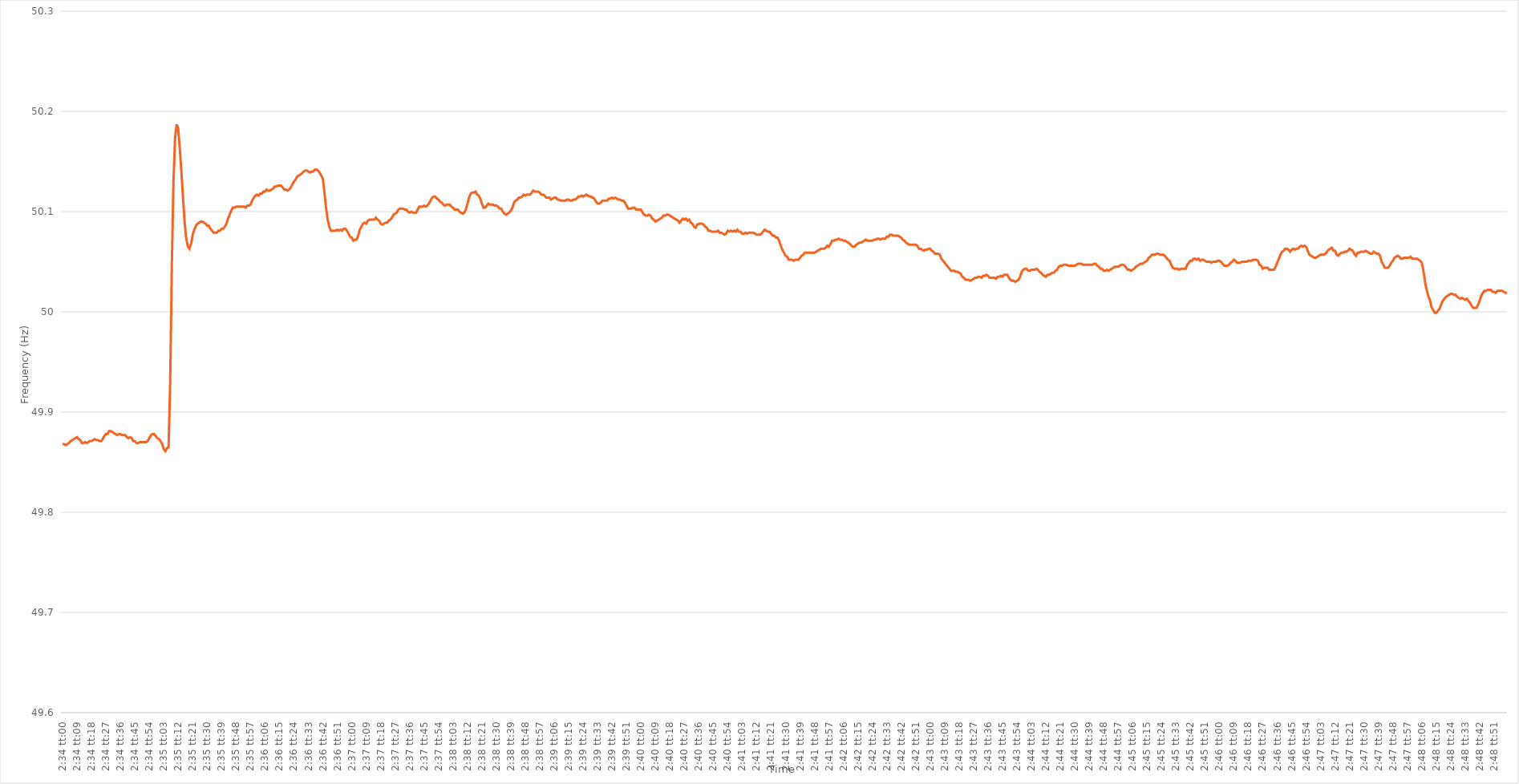
| Category | Series 0 |
|---|---|
| 0.10694444444444444 | 49.868 |
| 0.1069560185185185 | 49.868 |
| 0.10696759259259259 | 49.867 |
| 0.10697916666666667 | 49.868 |
| 0.10699074074074073 | 49.869 |
| 0.10700231481481481 | 49.871 |
| 0.1070138888888889 | 49.872 |
| 0.10702546296296296 | 49.873 |
| 0.10703703703703704 | 49.874 |
| 0.10704861111111112 | 49.875 |
| 0.10706018518518519 | 49.873 |
| 0.10707175925925926 | 49.872 |
| 0.10708333333333335 | 49.869 |
| 0.1070949074074074 | 49.869 |
| 0.10710648148148148 | 49.87 |
| 0.10711805555555555 | 49.869 |
| 0.10712962962962963 | 49.87 |
| 0.10714120370370371 | 49.871 |
| 0.10715277777777778 | 49.871 |
| 0.10716435185185186 | 49.872 |
| 0.10717592592592594 | 49.873 |
| 0.10718749999999999 | 49.872 |
| 0.10719907407407407 | 49.872 |
| 0.10721064814814814 | 49.871 |
| 0.10722222222222222 | 49.871 |
| 0.1072337962962963 | 49.873 |
| 0.10724537037037037 | 49.876 |
| 0.10725694444444445 | 49.878 |
| 0.10726851851851853 | 49.878 |
| 0.1072800925925926 | 49.881 |
| 0.10729166666666667 | 49.881 |
| 0.10730324074074075 | 49.88 |
| 0.10731481481481481 | 49.879 |
| 0.10732638888888889 | 49.878 |
| 0.10733796296296295 | 49.877 |
| 0.10734953703703703 | 49.878 |
| 0.10736111111111112 | 49.878 |
| 0.10737268518518518 | 49.877 |
| 0.10738425925925926 | 49.877 |
| 0.10739583333333334 | 49.877 |
| 0.1074074074074074 | 49.875 |
| 0.10741898148148148 | 49.874 |
| 0.10743055555555554 | 49.875 |
| 0.10744212962962962 | 49.874 |
| 0.1074537037037037 | 49.871 |
| 0.10746527777777777 | 49.871 |
| 0.10747685185185185 | 49.869 |
| 0.10748842592592593 | 49.869 |
| 0.1075 | 49.87 |
| 0.10751157407407408 | 49.87 |
| 0.10752314814814816 | 49.87 |
| 0.10753472222222223 | 49.87 |
| 0.1075462962962963 | 49.87 |
| 0.10755787037037036 | 49.871 |
| 0.10756944444444444 | 49.874 |
| 0.10758101851851852 | 49.877 |
| 0.10759259259259259 | 49.878 |
| 0.10760416666666667 | 49.878 |
| 0.10761574074074075 | 49.876 |
| 0.10762731481481481 | 49.874 |
| 0.1076388888888889 | 49.873 |
| 0.10765046296296295 | 49.871 |
| 0.10766203703703703 | 49.868 |
| 0.10767361111111111 | 49.863 |
| 0.10768518518518518 | 49.861 |
| 0.10769675925925926 | 49.864 |
| 0.10770833333333334 | 49.865 |
| 0.1077199074074074 | 49.93 |
| 0.10773148148148148 | 50.045 |
| 0.10774305555555556 | 50.128 |
| 0.10775462962962963 | 50.173 |
| 0.10776620370370371 | 50.187 |
| 0.10777777777777779 | 50.182 |
| 0.10778935185185186 | 50.162 |
| 0.10780092592592593 | 50.139 |
| 0.10781249999999999 | 50.113 |
| 0.10782407407407407 | 50.089 |
| 0.10783564814814815 | 50.073 |
| 0.10784722222222222 | 50.065 |
| 0.1078587962962963 | 50.063 |
| 0.10787037037037038 | 50.068 |
| 0.10788194444444445 | 50.077 |
| 0.10789351851851851 | 50.082 |
| 0.10790509259259258 | 50.086 |
| 0.10791666666666666 | 50.088 |
| 0.10792824074074074 | 50.089 |
| 0.10793981481481481 | 50.09 |
| 0.10795138888888889 | 50.09 |
| 0.10796296296296297 | 50.089 |
| 0.10797453703703704 | 50.088 |
| 0.10798611111111112 | 50.086 |
| 0.1079976851851852 | 50.086 |
| 0.10800925925925926 | 50.083 |
| 0.10802083333333333 | 50.081 |
| 0.10803240740740742 | 50.079 |
| 0.10804398148148148 | 50.079 |
| 0.10805555555555556 | 50.079 |
| 0.10806712962962962 | 50.081 |
| 0.1080787037037037 | 50.081 |
| 0.10809027777777779 | 50.083 |
| 0.10810185185185185 | 50.083 |
| 0.10811342592592592 | 50.085 |
| 0.10812500000000001 | 50.088 |
| 0.10813657407407407 | 50.093 |
| 0.10814814814814815 | 50.097 |
| 0.10815972222222221 | 50.101 |
| 0.1081712962962963 | 50.104 |
| 0.10818287037037037 | 50.104 |
| 0.10819444444444444 | 50.105 |
| 0.10820601851851852 | 50.105 |
| 0.1082175925925926 | 50.105 |
| 0.10822916666666667 | 50.105 |
| 0.10824074074074075 | 50.105 |
| 0.10825231481481483 | 50.105 |
| 0.10826388888888888 | 50.104 |
| 0.10827546296296296 | 50.106 |
| 0.10828703703703703 | 50.106 |
| 0.10829861111111111 | 50.107 |
| 0.10831018518518519 | 50.111 |
| 0.10832175925925926 | 50.114 |
| 0.10833333333333334 | 50.116 |
| 0.10834490740740742 | 50.117 |
| 0.10835648148148147 | 50.116 |
| 0.10836805555555555 | 50.118 |
| 0.10837962962962962 | 50.118 |
| 0.1083912037037037 | 50.12 |
| 0.10840277777777778 | 50.12 |
| 0.10841435185185185 | 50.122 |
| 0.10842592592592593 | 50.121 |
| 0.1084375 | 50.121 |
| 0.10844907407407407 | 50.122 |
| 0.10846064814814815 | 50.123 |
| 0.10847222222222223 | 50.125 |
| 0.1084837962962963 | 50.125 |
| 0.10849537037037038 | 50.126 |
| 0.10850694444444443 | 50.126 |
| 0.10851851851851851 | 50.126 |
| 0.1085300925925926 | 50.124 |
| 0.10854166666666666 | 50.122 |
| 0.10855324074074074 | 50.122 |
| 0.10856481481481482 | 50.121 |
| 0.10857638888888889 | 50.122 |
| 0.10858796296296297 | 50.124 |
| 0.10859953703703702 | 50.127 |
| 0.1086111111111111 | 50.13 |
| 0.10862268518518518 | 50.132 |
| 0.10863425925925925 | 50.135 |
| 0.10864583333333333 | 50.136 |
| 0.10865740740740741 | 50.137 |
| 0.10866898148148148 | 50.138 |
| 0.10868055555555556 | 50.14 |
| 0.10869212962962964 | 50.141 |
| 0.1087037037037037 | 50.141 |
| 0.10871527777777779 | 50.14 |
| 0.10872685185185187 | 50.139 |
| 0.10873842592592593 | 50.14 |
| 0.10875 | 50.14 |
| 0.10876157407407407 | 50.142 |
| 0.10877314814814815 | 50.142 |
| 0.10878472222222223 | 50.141 |
| 0.1087962962962963 | 50.139 |
| 0.10880787037037037 | 50.136 |
| 0.10881944444444445 | 50.133 |
| 0.10883101851851852 | 50.119 |
| 0.10884259259259259 | 50.104 |
| 0.10885416666666665 | 50.092 |
| 0.10886574074074074 | 50.085 |
| 0.10887731481481482 | 50.081 |
| 0.10888888888888888 | 50.081 |
| 0.10890046296296296 | 50.081 |
| 0.10891203703703704 | 50.081 |
| 0.10892361111111111 | 50.082 |
| 0.10893518518518519 | 50.081 |
| 0.10894675925925927 | 50.082 |
| 0.10895833333333334 | 50.081 |
| 0.1089699074074074 | 50.083 |
| 0.10898148148148147 | 50.083 |
| 0.10899305555555555 | 50.081 |
| 0.10900462962962963 | 50.078 |
| 0.1090162037037037 | 50.075 |
| 0.10902777777777778 | 50.074 |
| 0.10903935185185186 | 50.071 |
| 0.10905092592592593 | 50.072 |
| 0.10906249999999999 | 50.072 |
| 0.10907407407407409 | 50.076 |
| 0.10908564814814814 | 50.082 |
| 0.10909722222222222 | 50.085 |
| 0.10910879629629629 | 50.088 |
| 0.10912037037037037 | 50.089 |
| 0.10913194444444445 | 50.088 |
| 0.10914351851851851 | 50.091 |
| 0.1091550925925926 | 50.092 |
| 0.10916666666666668 | 50.092 |
| 0.10917824074074074 | 50.092 |
| 0.10918981481481482 | 50.092 |
| 0.1092013888888889 | 50.094 |
| 0.10921296296296296 | 50.092 |
| 0.10922453703703704 | 50.091 |
| 0.1092361111111111 | 50.088 |
| 0.10924768518518518 | 50.087 |
| 0.10925925925925926 | 50.088 |
| 0.10927083333333333 | 50.089 |
| 0.10928240740740741 | 50.089 |
| 0.10929398148148149 | 50.091 |
| 0.10930555555555554 | 50.092 |
| 0.10931712962962963 | 50.094 |
| 0.10932870370370369 | 50.097 |
| 0.10934027777777777 | 50.098 |
| 0.10935185185185185 | 50.099 |
| 0.10936342592592592 | 50.102 |
| 0.109375 | 50.103 |
| 0.10938657407407408 | 50.103 |
| 0.10939814814814815 | 50.103 |
| 0.10940972222222223 | 50.102 |
| 0.10942129629629631 | 50.102 |
| 0.10943287037037037 | 50.1 |
| 0.10944444444444446 | 50.099 |
| 0.10945601851851851 | 50.1 |
| 0.10946759259259259 | 50.099 |
| 0.10947916666666667 | 50.099 |
| 0.10949074074074074 | 50.099 |
| 0.10950231481481482 | 50.102 |
| 0.1095138888888889 | 50.105 |
| 0.10952546296296296 | 50.105 |
| 0.10953703703703704 | 50.105 |
| 0.1095486111111111 | 50.106 |
| 0.10956018518518518 | 50.105 |
| 0.10957175925925926 | 50.106 |
| 0.10958333333333332 | 50.108 |
| 0.1095949074074074 | 50.111 |
| 0.10960648148148149 | 50.114 |
| 0.10961805555555555 | 50.115 |
| 0.10962962962962963 | 50.115 |
| 0.10964120370370371 | 50.113 |
| 0.10965277777777778 | 50.112 |
| 0.10966435185185186 | 50.11 |
| 0.10967592592592591 | 50.109 |
| 0.10968750000000001 | 50.107 |
| 0.10969907407407407 | 50.106 |
| 0.10971064814814814 | 50.107 |
| 0.10972222222222222 | 50.107 |
| 0.1097337962962963 | 50.107 |
| 0.10974537037037037 | 50.105 |
| 0.10975694444444445 | 50.104 |
| 0.10976851851851853 | 50.102 |
| 0.1097800925925926 | 50.102 |
| 0.10979166666666666 | 50.102 |
| 0.10980324074074073 | 50.1 |
| 0.10981481481481481 | 50.099 |
| 0.10982638888888889 | 50.098 |
| 0.10983796296296296 | 50.099 |
| 0.10984953703703704 | 50.102 |
| 0.10986111111111112 | 50.108 |
| 0.10987268518518518 | 50.114 |
| 0.10988425925925926 | 50.118 |
| 0.10989583333333335 | 50.119 |
| 0.10990740740740741 | 50.119 |
| 0.10991898148148148 | 50.12 |
| 0.10993055555555555 | 50.117 |
| 0.10994212962962963 | 50.116 |
| 0.1099537037037037 | 50.113 |
| 0.10996527777777777 | 50.108 |
| 0.10997685185185185 | 50.104 |
| 0.10998842592592593 | 50.104 |
| 0.11 | 50.106 |
| 0.11001157407407407 | 50.108 |
| 0.11002314814814813 | 50.107 |
| 0.11003472222222221 | 50.107 |
| 0.1100462962962963 | 50.107 |
| 0.11005787037037036 | 50.106 |
| 0.11006944444444444 | 50.106 |
| 0.11008101851851852 | 50.105 |
| 0.11009259259259259 | 50.103 |
| 0.11010416666666667 | 50.103 |
| 0.11011574074074075 | 50.1 |
| 0.11012731481481482 | 50.098 |
| 0.1101388888888889 | 50.097 |
| 0.11015046296296298 | 50.098 |
| 0.11016203703703703 | 50.099 |
| 0.11017361111111111 | 50.101 |
| 0.11018518518518518 | 50.104 |
| 0.11019675925925926 | 50.109 |
| 0.11020833333333334 | 50.111 |
| 0.1102199074074074 | 50.112 |
| 0.11023148148148149 | 50.114 |
| 0.11024305555555557 | 50.114 |
| 0.11025462962962962 | 50.115 |
| 0.1102662037037037 | 50.117 |
| 0.11027777777777777 | 50.116 |
| 0.11028935185185185 | 50.117 |
| 0.11030092592592593 | 50.117 |
| 0.1103125 | 50.117 |
| 0.11032407407407407 | 50.119 |
| 0.11033564814814815 | 50.121 |
| 0.11034722222222222 | 50.12 |
| 0.1103587962962963 | 50.12 |
| 0.11037037037037038 | 50.12 |
| 0.11038194444444445 | 50.119 |
| 0.11039351851851853 | 50.117 |
| 0.11040509259259258 | 50.117 |
| 0.11041666666666666 | 50.116 |
| 0.11042824074074074 | 50.114 |
| 0.11043981481481481 | 50.114 |
| 0.11045138888888889 | 50.114 |
| 0.11046296296296297 | 50.112 |
| 0.11047453703703704 | 50.113 |
| 0.11048611111111112 | 50.114 |
| 0.11049768518518517 | 50.114 |
| 0.11050925925925925 | 50.112 |
| 0.11052083333333333 | 50.112 |
| 0.1105324074074074 | 50.111 |
| 0.11054398148148148 | 50.111 |
| 0.11055555555555556 | 50.111 |
| 0.11056712962962963 | 50.111 |
| 0.1105787037037037 | 50.112 |
| 0.11059027777777779 | 50.112 |
| 0.11060185185185185 | 50.111 |
| 0.11061342592592593 | 50.111 |
| 0.11062499999999999 | 50.112 |
| 0.11063657407407408 | 50.112 |
| 0.11064814814814815 | 50.113 |
| 0.11065972222222221 | 50.115 |
| 0.1106712962962963 | 50.115 |
| 0.11068287037037038 | 50.116 |
| 0.11069444444444444 | 50.115 |
| 0.11070601851851852 | 50.116 |
| 0.11071759259259258 | 50.117 |
| 0.11072916666666667 | 50.116 |
| 0.11074074074074074 | 50.115 |
| 0.1107523148148148 | 50.115 |
| 0.11076388888888888 | 50.114 |
| 0.11077546296296296 | 50.113 |
| 0.11078703703703703 | 50.11 |
| 0.11079861111111111 | 50.108 |
| 0.11081018518518519 | 50.108 |
| 0.11082175925925926 | 50.109 |
| 0.11083333333333334 | 50.111 |
| 0.11084490740740742 | 50.111 |
| 0.11085648148148149 | 50.111 |
| 0.11086805555555555 | 50.111 |
| 0.11087962962962962 | 50.113 |
| 0.1108912037037037 | 50.113 |
| 0.11090277777777778 | 50.114 |
| 0.11091435185185185 | 50.113 |
| 0.11092592592592593 | 50.114 |
| 0.11093750000000001 | 50.113 |
| 0.11094907407407407 | 50.112 |
| 0.11096064814814814 | 50.112 |
| 0.11097222222222221 | 50.111 |
| 0.11098379629629629 | 50.111 |
| 0.11099537037037037 | 50.109 |
| 0.11100694444444444 | 50.106 |
| 0.11101851851851852 | 50.103 |
| 0.1110300925925926 | 50.103 |
| 0.11104166666666666 | 50.103 |
| 0.11105324074074074 | 50.104 |
| 0.11106481481481482 | 50.104 |
| 0.11107638888888889 | 50.102 |
| 0.11108796296296297 | 50.102 |
| 0.11109953703703705 | 50.102 |
| 0.1111111111111111 | 50.102 |
| 0.11112268518518519 | 50.099 |
| 0.11113425925925925 | 50.097 |
| 0.11114583333333333 | 50.096 |
| 0.11115740740740741 | 50.096 |
| 0.11116898148148148 | 50.097 |
| 0.11118055555555556 | 50.096 |
| 0.11119212962962964 | 50.093 |
| 0.1112037037037037 | 50.092 |
| 0.11121527777777777 | 50.09 |
| 0.11122685185185184 | 50.091 |
| 0.11123842592592592 | 50.092 |
| 0.11125 | 50.093 |
| 0.11126157407407407 | 50.094 |
| 0.11127314814814815 | 50.096 |
| 0.11128472222222223 | 50.096 |
| 0.1112962962962963 | 50.097 |
| 0.11130787037037038 | 50.097 |
| 0.11131944444444446 | 50.096 |
| 0.11133101851851852 | 50.095 |
| 0.1113425925925926 | 50.094 |
| 0.11135416666666666 | 50.093 |
| 0.11136574074074074 | 50.092 |
| 0.11137731481481482 | 50.091 |
| 0.11138888888888888 | 50.089 |
| 0.11140046296296297 | 50.091 |
| 0.11141203703703705 | 50.093 |
| 0.11142361111111111 | 50.092 |
| 0.11143518518518519 | 50.093 |
| 0.11144675925925925 | 50.091 |
| 0.11145833333333333 | 50.092 |
| 0.1114699074074074 | 50.089 |
| 0.11148148148148147 | 50.088 |
| 0.11149305555555555 | 50.085 |
| 0.11150462962962963 | 50.084 |
| 0.1115162037037037 | 50.087 |
| 0.11152777777777778 | 50.088 |
| 0.11153935185185186 | 50.088 |
| 0.11155092592592593 | 50.088 |
| 0.11156250000000001 | 50.087 |
| 0.11157407407407406 | 50.085 |
| 0.11158564814814814 | 50.084 |
| 0.11159722222222222 | 50.081 |
| 0.11160879629629629 | 50.081 |
| 0.11162037037037037 | 50.08 |
| 0.11163194444444445 | 50.08 |
| 0.11164351851851852 | 50.08 |
| 0.1116550925925926 | 50.08 |
| 0.11166666666666665 | 50.081 |
| 0.11167824074074074 | 50.079 |
| 0.11168981481481481 | 50.079 |
| 0.11170138888888888 | 50.078 |
| 0.11171296296296296 | 50.077 |
| 0.11172453703703704 | 50.078 |
| 0.1117361111111111 | 50.081 |
| 0.11174768518518519 | 50.08 |
| 0.11175925925925927 | 50.081 |
| 0.11177083333333333 | 50.08 |
| 0.11178240740740741 | 50.081 |
| 0.1117939814814815 | 50.08 |
| 0.11180555555555556 | 50.082 |
| 0.11181712962962963 | 50.08 |
| 0.1118287037037037 | 50.08 |
| 0.11184027777777777 | 50.078 |
| 0.11185185185185186 | 50.078 |
| 0.11186342592592592 | 50.079 |
| 0.111875 | 50.078 |
| 0.11188657407407408 | 50.079 |
| 0.11189814814814815 | 50.079 |
| 0.11190972222222222 | 50.079 |
| 0.11192129629629628 | 50.079 |
| 0.11193287037037036 | 50.078 |
| 0.11194444444444444 | 50.077 |
| 0.11195601851851851 | 50.077 |
| 0.11196759259259259 | 50.077 |
| 0.11197916666666667 | 50.078 |
| 0.11199074074074074 | 50.08 |
| 0.11200231481481482 | 50.082 |
| 0.1120138888888889 | 50.081 |
| 0.11202546296296297 | 50.08 |
| 0.11203703703703705 | 50.08 |
| 0.11204861111111113 | 50.078 |
| 0.11206018518518518 | 50.076 |
| 0.11207175925925926 | 50.076 |
| 0.11208333333333333 | 50.074 |
| 0.11209490740740741 | 50.074 |
| 0.11210648148148149 | 50.071 |
| 0.11211805555555555 | 50.066 |
| 0.11212962962962963 | 50.062 |
| 0.11214120370370372 | 50.059 |
| 0.11215277777777777 | 50.056 |
| 0.11216435185185185 | 50.055 |
| 0.11217592592592592 | 50.052 |
| 0.1121875 | 50.052 |
| 0.11219907407407408 | 50.052 |
| 0.11221064814814814 | 50.051 |
| 0.11222222222222222 | 50.052 |
| 0.1122337962962963 | 50.052 |
| 0.11224537037037037 | 50.052 |
| 0.11225694444444445 | 50.054 |
| 0.11226851851851853 | 50.056 |
| 0.11228009259259258 | 50.057 |
| 0.11229166666666668 | 50.059 |
| 0.11230324074074073 | 50.059 |
| 0.11231481481481481 | 50.059 |
| 0.11232638888888889 | 50.059 |
| 0.11233796296296296 | 50.059 |
| 0.11234953703703704 | 50.059 |
| 0.11236111111111112 | 50.059 |
| 0.11237268518518519 | 50.06 |
| 0.11238425925925927 | 50.061 |
| 0.11239583333333332 | 50.062 |
| 0.1124074074074074 | 50.063 |
| 0.11241898148148148 | 50.063 |
| 0.11243055555555555 | 50.063 |
| 0.11244212962962963 | 50.064 |
| 0.11245370370370371 | 50.066 |
| 0.11246527777777778 | 50.065 |
| 0.11247685185185186 | 50.068 |
| 0.11248842592592594 | 50.071 |
| 0.1125 | 50.071 |
| 0.11251157407407408 | 50.072 |
| 0.11252314814814814 | 50.072 |
| 0.11253472222222222 | 50.073 |
| 0.1125462962962963 | 50.072 |
| 0.11255787037037036 | 50.072 |
| 0.11256944444444444 | 50.071 |
| 0.11258101851851852 | 50.071 |
| 0.11259259259259259 | 50.07 |
| 0.11260416666666667 | 50.069 |
| 0.11261574074074072 | 50.068 |
| 0.1126273148148148 | 50.066 |
| 0.11263888888888889 | 50.065 |
| 0.11265046296296295 | 50.065 |
| 0.11266203703703703 | 50.067 |
| 0.11267361111111111 | 50.068 |
| 0.11268518518518518 | 50.069 |
| 0.11269675925925926 | 50.069 |
| 0.11270833333333334 | 50.07 |
| 0.11271990740740741 | 50.071 |
| 0.11273148148148149 | 50.072 |
| 0.11274305555555557 | 50.071 |
| 0.11275462962962964 | 50.071 |
| 0.1127662037037037 | 50.071 |
| 0.11277777777777777 | 50.071 |
| 0.11278935185185185 | 50.072 |
| 0.11280092592592593 | 50.072 |
| 0.1128125 | 50.073 |
| 0.11282407407407408 | 50.073 |
| 0.11283564814814816 | 50.072 |
| 0.11284722222222222 | 50.073 |
| 0.11285879629629629 | 50.073 |
| 0.11287037037037036 | 50.073 |
| 0.11288194444444444 | 50.075 |
| 0.11289351851851852 | 50.075 |
| 0.11290509259259258 | 50.077 |
| 0.11291666666666667 | 50.077 |
| 0.11292824074074075 | 50.076 |
| 0.11293981481481481 | 50.076 |
| 0.11295138888888889 | 50.076 |
| 0.11296296296296297 | 50.076 |
| 0.11297453703703704 | 50.075 |
| 0.11298611111111112 | 50.074 |
| 0.1129976851851852 | 50.072 |
| 0.11300925925925925 | 50.071 |
| 0.11302083333333333 | 50.069 |
| 0.1130324074074074 | 50.068 |
| 0.11304398148148148 | 50.067 |
| 0.11305555555555556 | 50.067 |
| 0.11306712962962963 | 50.067 |
| 0.11307870370370371 | 50.067 |
| 0.11309027777777779 | 50.067 |
| 0.11310185185185184 | 50.066 |
| 0.11311342592592592 | 50.063 |
| 0.11312499999999999 | 50.063 |
| 0.11313657407407407 | 50.062 |
| 0.11314814814814815 | 50.061 |
| 0.11315972222222222 | 50.062 |
| 0.1131712962962963 | 50.062 |
| 0.11318287037037038 | 50.063 |
| 0.11319444444444444 | 50.063 |
| 0.11320601851851853 | 50.061 |
| 0.1132175925925926 | 50.06 |
| 0.11322916666666666 | 50.058 |
| 0.11324074074074075 | 50.058 |
| 0.1132523148148148 | 50.058 |
| 0.11326388888888889 | 50.057 |
| 0.11327546296296297 | 50.053 |
| 0.11328703703703703 | 50.051 |
| 0.11329861111111111 | 50.049 |
| 0.1133101851851852 | 50.047 |
| 0.11332175925925925 | 50.045 |
| 0.11333333333333334 | 50.043 |
| 0.1133449074074074 | 50.041 |
| 0.11335648148148147 | 50.041 |
| 0.11336805555555556 | 50.041 |
| 0.11337962962962962 | 50.04 |
| 0.1133912037037037 | 50.04 |
| 0.11340277777777778 | 50.039 |
| 0.11341435185185185 | 50.038 |
| 0.11342592592592593 | 50.035 |
| 0.11343750000000001 | 50.034 |
| 0.11344907407407408 | 50.032 |
| 0.11346064814814816 | 50.032 |
| 0.11347222222222221 | 50.032 |
| 0.11348379629629629 | 50.031 |
| 0.11349537037037037 | 50.032 |
| 0.11350694444444444 | 50.033 |
| 0.11351851851851852 | 50.034 |
| 0.1135300925925926 | 50.034 |
| 0.11354166666666667 | 50.035 |
| 0.11355324074074075 | 50.035 |
| 0.1135648148148148 | 50.034 |
| 0.11357638888888888 | 50.036 |
| 0.11358796296296296 | 50.036 |
| 0.11359953703703703 | 50.037 |
| 0.11361111111111111 | 50.036 |
| 0.11362268518518519 | 50.034 |
| 0.11363425925925925 | 50.034 |
| 0.11364583333333333 | 50.034 |
| 0.11365740740740742 | 50.034 |
| 0.11366898148148148 | 50.033 |
| 0.11368055555555556 | 50.035 |
| 0.11369212962962964 | 50.035 |
| 0.11370370370370371 | 50.036 |
| 0.11371527777777778 | 50.035 |
| 0.11372685185185184 | 50.037 |
| 0.11373842592592592 | 50.037 |
| 0.11375 | 50.037 |
| 0.11376157407407407 | 50.034 |
| 0.11377314814814815 | 50.032 |
| 0.11378472222222223 | 50.031 |
| 0.1137962962962963 | 50.031 |
| 0.11380787037037036 | 50.03 |
| 0.11381944444444443 | 50.031 |
| 0.11383101851851851 | 50.032 |
| 0.11384259259259259 | 50.035 |
| 0.11385416666666666 | 50.04 |
| 0.11386574074074074 | 50.042 |
| 0.11387731481481482 | 50.043 |
| 0.11388888888888889 | 50.043 |
| 0.11390046296296297 | 50.041 |
| 0.11391203703703705 | 50.041 |
| 0.11392361111111111 | 50.042 |
| 0.1139351851851852 | 50.042 |
| 0.11394675925925928 | 50.042 |
| 0.11395833333333333 | 50.043 |
| 0.11396990740740741 | 50.042 |
| 0.11398148148148148 | 50.04 |
| 0.11399305555555556 | 50.039 |
| 0.11400462962962964 | 50.037 |
| 0.1140162037037037 | 50.036 |
| 0.11402777777777778 | 50.035 |
| 0.11403935185185186 | 50.037 |
| 0.11405092592592592 | 50.037 |
| 0.1140625 | 50.038 |
| 0.11407407407407406 | 50.039 |
| 0.11408564814814814 | 50.039 |
| 0.11409722222222222 | 50.041 |
| 0.11410879629629629 | 50.042 |
| 0.11412037037037037 | 50.045 |
| 0.11413194444444445 | 50.046 |
| 0.11414351851851852 | 50.046 |
| 0.1141550925925926 | 50.047 |
| 0.11416666666666668 | 50.047 |
| 0.11417824074074073 | 50.047 |
| 0.11418981481481481 | 50.046 |
| 0.11420138888888888 | 50.046 |
| 0.11421296296296296 | 50.046 |
| 0.11422453703703704 | 50.046 |
| 0.11423611111111111 | 50.046 |
| 0.11424768518518519 | 50.047 |
| 0.11425925925925927 | 50.048 |
| 0.11427083333333332 | 50.048 |
| 0.11428240740740742 | 50.048 |
| 0.11429398148148147 | 50.047 |
| 0.11430555555555555 | 50.047 |
| 0.11431712962962963 | 50.047 |
| 0.1143287037037037 | 50.047 |
| 0.11434027777777778 | 50.047 |
| 0.11435185185185186 | 50.047 |
| 0.11436342592592592 | 50.047 |
| 0.114375 | 50.048 |
| 0.11438657407407408 | 50.048 |
| 0.11439814814814815 | 50.046 |
| 0.11440972222222223 | 50.045 |
| 0.11442129629629628 | 50.043 |
| 0.11443287037037037 | 50.043 |
| 0.11444444444444445 | 50.041 |
| 0.11445601851851851 | 50.041 |
| 0.11446759259259259 | 50.042 |
| 0.11447916666666667 | 50.041 |
| 0.11449074074074074 | 50.042 |
| 0.11450231481481482 | 50.043 |
| 0.11451388888888887 | 50.044 |
| 0.11452546296296295 | 50.045 |
| 0.11453703703703703 | 50.045 |
| 0.1145486111111111 | 50.045 |
| 0.11456018518518518 | 50.046 |
| 0.11457175925925926 | 50.047 |
| 0.11458333333333333 | 50.047 |
| 0.11459490740740741 | 50.046 |
| 0.11460648148148149 | 50.044 |
| 0.11461805555555556 | 50.042 |
| 0.11462962962962964 | 50.042 |
| 0.11464120370370372 | 50.041 |
| 0.11465277777777778 | 50.042 |
| 0.11466435185185185 | 50.043 |
| 0.11467592592592592 | 50.045 |
| 0.1146875 | 50.046 |
| 0.11469907407407408 | 50.047 |
| 0.11471064814814814 | 50.048 |
| 0.11472222222222223 | 50.048 |
| 0.1147337962962963 | 50.049 |
| 0.11474537037037037 | 50.05 |
| 0.11475694444444444 | 50.051 |
| 0.1147685185185185 | 50.054 |
| 0.11478009259259259 | 50.055 |
| 0.11479166666666667 | 50.057 |
| 0.11480324074074073 | 50.057 |
| 0.11481481481481481 | 50.057 |
| 0.1148263888888889 | 50.058 |
| 0.11483796296296296 | 50.058 |
| 0.11484953703703704 | 50.057 |
| 0.11486111111111112 | 50.057 |
| 0.11487268518518519 | 50.057 |
| 0.11488425925925926 | 50.056 |
| 0.11489583333333335 | 50.054 |
| 0.1149074074074074 | 50.052 |
| 0.11491898148148148 | 50.051 |
| 0.11493055555555555 | 50.047 |
| 0.11494212962962963 | 50.044 |
| 0.11495370370370371 | 50.043 |
| 0.11496527777777778 | 50.043 |
| 0.11497685185185186 | 50.043 |
| 0.11498842592592594 | 50.042 |
| 0.11499999999999999 | 50.043 |
| 0.11501157407407407 | 50.043 |
| 0.11502314814814814 | 50.043 |
| 0.11503472222222222 | 50.043 |
| 0.1150462962962963 | 50.047 |
| 0.11505787037037037 | 50.049 |
| 0.11506944444444445 | 50.051 |
| 0.11508101851851853 | 50.051 |
| 0.1150925925925926 | 50.053 |
| 0.11510416666666667 | 50.053 |
| 0.11511574074074075 | 50.052 |
| 0.11512731481481481 | 50.053 |
| 0.11513888888888889 | 50.051 |
| 0.11515046296296295 | 50.052 |
| 0.11516203703703703 | 50.052 |
| 0.11517361111111112 | 50.051 |
| 0.11518518518518518 | 50.05 |
| 0.11519675925925926 | 50.05 |
| 0.11520833333333334 | 50.05 |
| 0.1152199074074074 | 50.049 |
| 0.11523148148148148 | 50.05 |
| 0.11524305555555554 | 50.05 |
| 0.11525462962962962 | 50.05 |
| 0.1152662037037037 | 50.051 |
| 0.11527777777777777 | 50.051 |
| 0.11528935185185185 | 50.05 |
| 0.11530092592592593 | 50.048 |
| 0.1153125 | 50.046 |
| 0.11532407407407408 | 50.046 |
| 0.11533564814814816 | 50.046 |
| 0.11534722222222223 | 50.047 |
| 0.1153587962962963 | 50.049 |
| 0.11537037037037036 | 50.05 |
| 0.11538194444444444 | 50.052 |
| 0.11539351851851852 | 50.051 |
| 0.11540509259259259 | 50.049 |
| 0.11541666666666667 | 50.049 |
| 0.11542824074074075 | 50.049 |
| 0.11543981481481481 | 50.05 |
| 0.1154513888888889 | 50.05 |
| 0.11546296296296295 | 50.05 |
| 0.11547453703703703 | 50.05 |
| 0.11548611111111111 | 50.051 |
| 0.11549768518518518 | 50.051 |
| 0.11550925925925926 | 50.051 |
| 0.11552083333333334 | 50.052 |
| 0.1155324074074074 | 50.052 |
| 0.11554398148148148 | 50.052 |
| 0.11555555555555556 | 50.051 |
| 0.11556712962962963 | 50.047 |
| 0.11557870370370371 | 50.046 |
| 0.11559027777777779 | 50.043 |
| 0.11560185185185186 | 50.044 |
| 0.11561342592592593 | 50.044 |
| 0.11562499999999999 | 50.044 |
| 0.11563657407407407 | 50.042 |
| 0.11564814814814815 | 50.042 |
| 0.11565972222222222 | 50.042 |
| 0.1156712962962963 | 50.042 |
| 0.11568287037037038 | 50.045 |
| 0.11569444444444445 | 50.049 |
| 0.11570601851851851 | 50.053 |
| 0.11571759259259258 | 50.057 |
| 0.11572916666666666 | 50.06 |
| 0.11574074074074074 | 50.061 |
| 0.11575231481481481 | 50.063 |
| 0.11576388888888889 | 50.063 |
| 0.11577546296296297 | 50.062 |
| 0.11578703703703704 | 50.06 |
| 0.11579861111111112 | 50.062 |
| 0.1158101851851852 | 50.063 |
| 0.11582175925925926 | 50.062 |
| 0.11583333333333333 | 50.063 |
| 0.11584490740740742 | 50.063 |
| 0.11585648148148148 | 50.065 |
| 0.11586805555555556 | 50.066 |
| 0.11587962962962962 | 50.065 |
| 0.1158912037037037 | 50.066 |
| 0.11590277777777779 | 50.065 |
| 0.11591435185185185 | 50.061 |
| 0.11592592592592592 | 50.057 |
| 0.11593750000000001 | 50.056 |
| 0.11594907407407407 | 50.055 |
| 0.11596064814814815 | 50.054 |
| 0.11597222222222221 | 50.054 |
| 0.1159837962962963 | 50.055 |
| 0.11599537037037037 | 50.056 |
| 0.11600694444444444 | 50.057 |
| 0.11601851851851852 | 50.057 |
| 0.1160300925925926 | 50.057 |
| 0.11604166666666667 | 50.058 |
| 0.11605324074074075 | 50.06 |
| 0.11606481481481483 | 50.062 |
| 0.11607638888888888 | 50.063 |
| 0.11608796296296296 | 50.064 |
| 0.11609953703703703 | 50.061 |
| 0.11611111111111111 | 50.061 |
| 0.11612268518518519 | 50.057 |
| 0.11613425925925926 | 50.056 |
| 0.11614583333333334 | 50.058 |
| 0.11615740740740742 | 50.059 |
| 0.11616898148148147 | 50.059 |
| 0.11618055555555555 | 50.06 |
| 0.11619212962962962 | 50.06 |
| 0.1162037037037037 | 50.061 |
| 0.11621527777777778 | 50.063 |
| 0.11622685185185185 | 50.062 |
| 0.11623842592592593 | 50.061 |
| 0.11625 | 50.058 |
| 0.11626157407407407 | 50.056 |
| 0.11627314814814815 | 50.059 |
| 0.11628472222222223 | 50.059 |
| 0.1162962962962963 | 50.06 |
| 0.11630787037037038 | 50.06 |
| 0.11631944444444443 | 50.06 |
| 0.11633101851851851 | 50.061 |
| 0.1163425925925926 | 50.06 |
| 0.11635416666666666 | 50.059 |
| 0.11636574074074074 | 50.058 |
| 0.11637731481481482 | 50.058 |
| 0.11638888888888889 | 50.06 |
| 0.11640046296296297 | 50.059 |
| 0.11641203703703702 | 50.058 |
| 0.1164236111111111 | 50.058 |
| 0.11643518518518518 | 50.056 |
| 0.11644675925925925 | 50.05 |
| 0.11645833333333333 | 50.047 |
| 0.11646990740740741 | 50.044 |
| 0.11648148148148148 | 50.044 |
| 0.11649305555555556 | 50.044 |
| 0.11650462962962964 | 50.046 |
| 0.1165162037037037 | 50.049 |
| 0.11652777777777779 | 50.051 |
| 0.11653935185185187 | 50.054 |
| 0.11655092592592593 | 50.055 |
| 0.1165625 | 50.056 |
| 0.11657407407407407 | 50.055 |
| 0.11658564814814815 | 50.053 |
| 0.11659722222222223 | 50.053 |
| 0.1166087962962963 | 50.054 |
| 0.11662037037037037 | 50.054 |
| 0.11663194444444445 | 50.054 |
| 0.11664351851851852 | 50.054 |
| 0.11665509259259259 | 50.055 |
| 0.11666666666666665 | 50.053 |
| 0.11667824074074074 | 50.053 |
| 0.11668981481481482 | 50.053 |
| 0.11670138888888888 | 50.053 |
| 0.11671296296296296 | 50.052 |
| 0.11672453703703704 | 50.051 |
| 0.11673611111111111 | 50.049 |
| 0.11674768518518519 | 50.041 |
| 0.11675925925925927 | 50.03 |
| 0.11677083333333334 | 50.022 |
| 0.1167824074074074 | 50.016 |
| 0.11679398148148147 | 50.012 |
| 0.11680555555555555 | 50.005 |
| 0.11681712962962963 | 50.002 |
| 0.1168287037037037 | 49.999 |
| 0.11684027777777778 | 49.999 |
| 0.11685185185185186 | 50.001 |
| 0.11686342592592593 | 50.003 |
| 0.11687499999999999 | 50.007 |
| 0.11688657407407409 | 50.011 |
| 0.11689814814814814 | 50.013 |
| 0.11690972222222222 | 50.015 |
| 0.11692129629629629 | 50.016 |
| 0.11693287037037037 | 50.017 |
| 0.11694444444444445 | 50.018 |
| 0.11695601851851851 | 50.018 |
| 0.1169675925925926 | 50.017 |
| 0.11697916666666668 | 50.017 |
| 0.11699074074074074 | 50.015 |
| 0.11700231481481482 | 50.014 |
| 0.1170138888888889 | 50.013 |
| 0.11702546296296296 | 50.014 |
| 0.11703703703703704 | 50.013 |
| 0.1170486111111111 | 50.012 |
| 0.11706018518518518 | 50.013 |
| 0.11707175925925926 | 50.011 |
| 0.11708333333333333 | 50.009 |
| 0.11709490740740741 | 50.006 |
| 0.11710648148148149 | 50.004 |
| 0.11711805555555554 | 50.004 |
| 0.11712962962962963 | 50.004 |
| 0.11714120370370369 | 50.007 |
| 0.11715277777777777 | 50.011 |
| 0.11716435185185185 | 50.016 |
| 0.11717592592592592 | 50.019 |
| 0.1171875 | 50.021 |
| 0.11719907407407408 | 50.021 |
| 0.11721064814814815 | 50.022 |
| 0.11722222222222223 | 50.022 |
| 0.11723379629629631 | 50.022 |
| 0.11724537037037037 | 50.02 |
| 0.11725694444444446 | 50.02 |
| 0.11726851851851851 | 50.019 |
| 0.11728009259259259 | 50.021 |
| 0.11729166666666667 | 50.021 |
| 0.11730324074074074 | 50.021 |
| 0.11731481481481482 | 50.021 |
| 0.1173263888888889 | 50.02 |
| 0.11733796296296296 | 50.019 |
| 0.11734953703703704 | 50.019 |